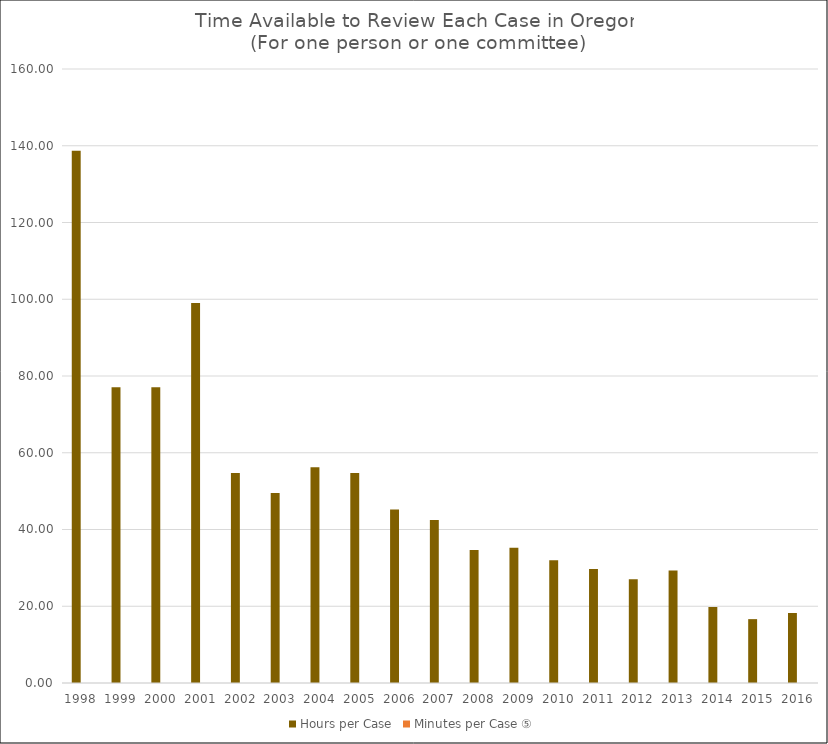
| Category | Hours per Case | Minutes per Case ⑤ |
|---|---|---|
| 1998 | 138.667 |  |
| 1999 | 77.037 |  |
| 2000 | 77.037 |  |
| 2001 | 99.048 |  |
| 2002 | 54.737 |  |
| 2003 | 49.524 |  |
| 2004 | 56.216 |  |
| 2005 | 54.737 |  |
| 2006 | 45.217 |  |
| 2007 | 42.449 |  |
| 2008 | 34.667 |  |
| 2009 | 35.254 |  |
| 2010 | 32 |  |
| 2011 | 29.714 |  |
| 2012 | 27.013 |  |
| 2013 | 29.296 |  |
| 2014 | 19.81 |  |
| 2015 | 16.64 |  |
| 2016 | 18.246 |  |